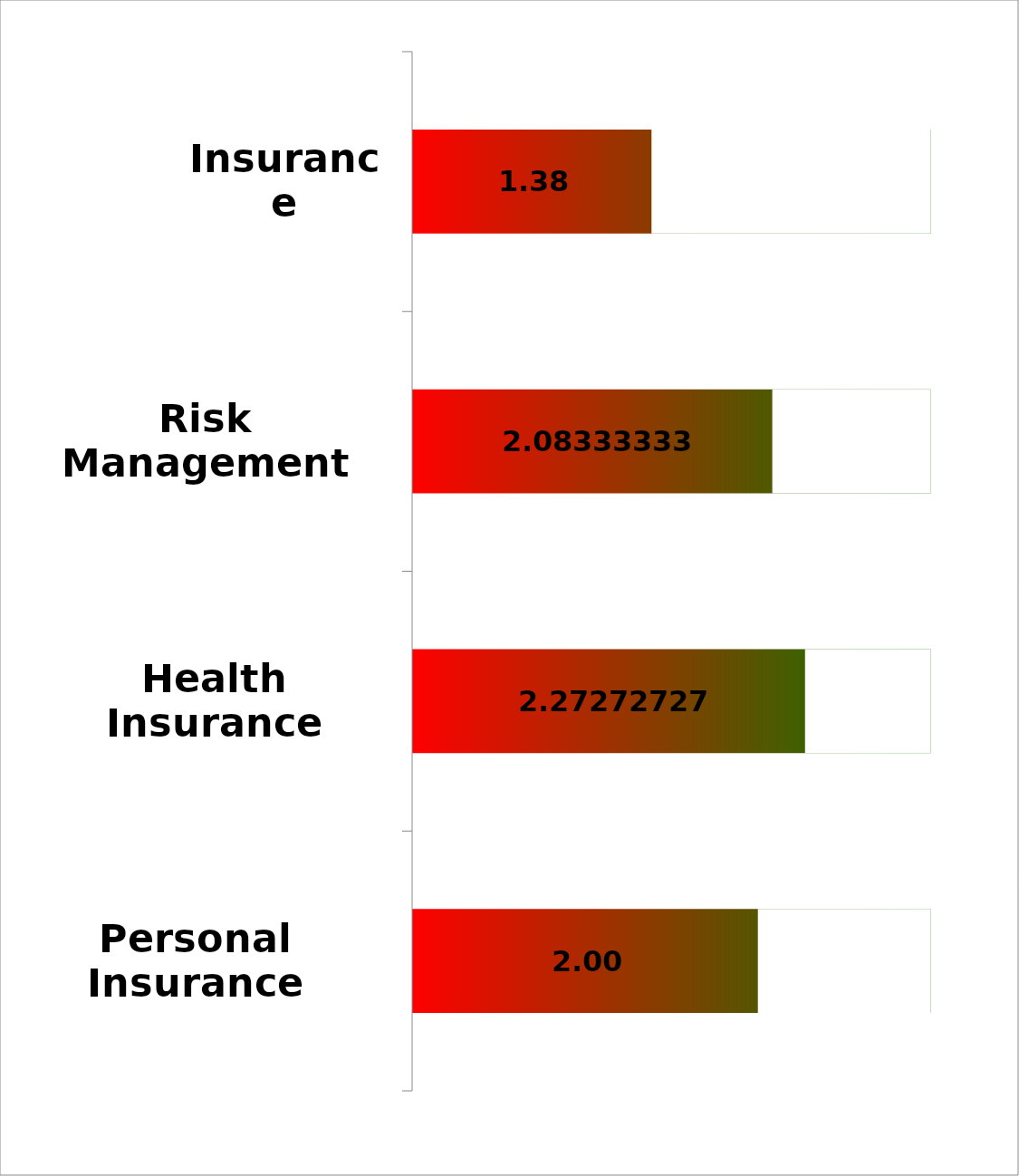
| Category | Series 2 |
|---|---|
| Personal Insurance | 3 |
| Health Insurance Options | 3 |
| Risk Management and Mitigation | 3 |
| Insurance | 3 |